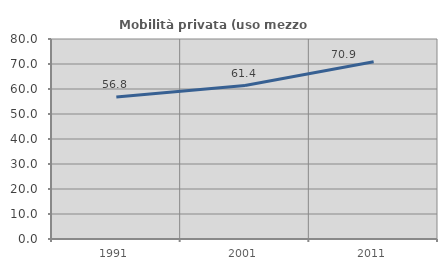
| Category | Mobilità privata (uso mezzo privato) |
|---|---|
| 1991.0 | 56.783 |
| 2001.0 | 61.375 |
| 2011.0 | 70.866 |